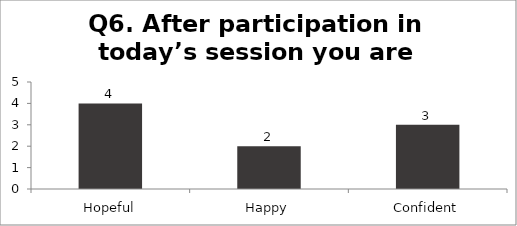
| Category | Q6. After participation in today’s session you are feeling? |
|---|---|
| Hopeful | 4 |
| Happy | 2 |
| Confident | 3 |